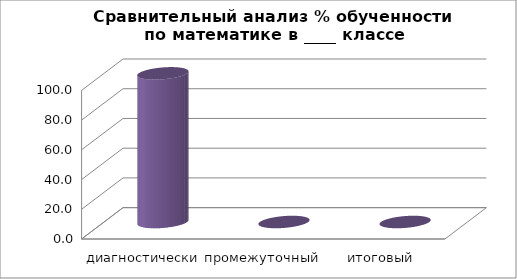
| Category | Series 0 |
|---|---|
| диагностический | 100 |
| промежуточный  | 0 |
| итоговый  | 0 |